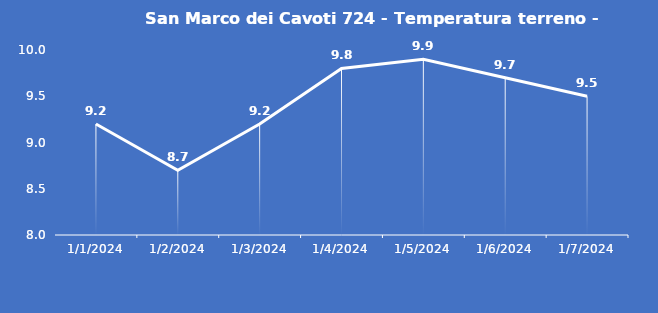
| Category | San Marco dei Cavoti 724 - Temperatura terreno - Grezzo (°C) |
|---|---|
| 1/1/24 | 9.2 |
| 1/2/24 | 8.7 |
| 1/3/24 | 9.2 |
| 1/4/24 | 9.8 |
| 1/5/24 | 9.9 |
| 1/6/24 | 9.7 |
| 1/7/24 | 9.5 |